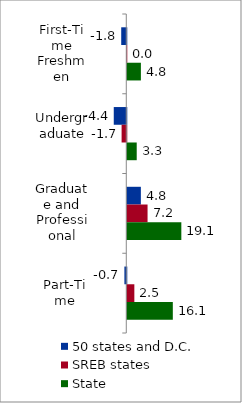
| Category | 50 states and D.C. | SREB states | State |
|---|---|---|---|
| First-Time Freshmen | -1.792 | 0.001 | 4.81 |
| Undergraduate | -4.428 | -1.658 | 3.336 |
| Graduate and Professional | 4.8 | 7.167 | 19.108 |
| Part-Time | -0.669 | 2.497 | 16.099 |